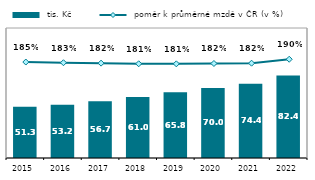
| Category |  tis. Kč |
|---|---|
| 2015.0 | 51.319 |
| 2016.0 | 53.241 |
| 2017.0 | 56.747 |
| 2018.0 | 61.026 |
| 2019.0 | 65.787 |
| 2020.0 | 70.018 |
| 2021.0 | 74.357 |
| 2022.0 | 82.441 |